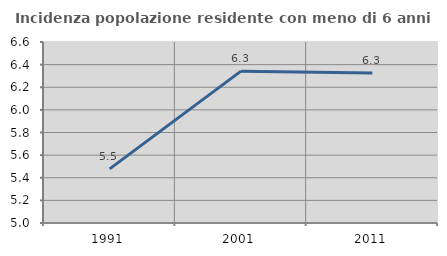
| Category | Incidenza popolazione residente con meno di 6 anni |
|---|---|
| 1991.0 | 5.478 |
| 2001.0 | 6.342 |
| 2011.0 | 6.326 |